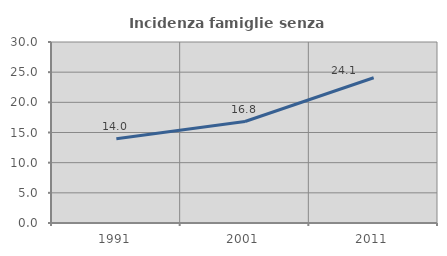
| Category | Incidenza famiglie senza nuclei |
|---|---|
| 1991.0 | 13.96 |
| 2001.0 | 16.821 |
| 2011.0 | 24.077 |